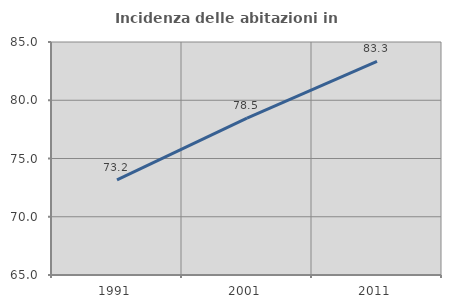
| Category | Incidenza delle abitazioni in proprietà  |
|---|---|
| 1991.0 | 73.174 |
| 2001.0 | 78.469 |
| 2011.0 | 83.347 |